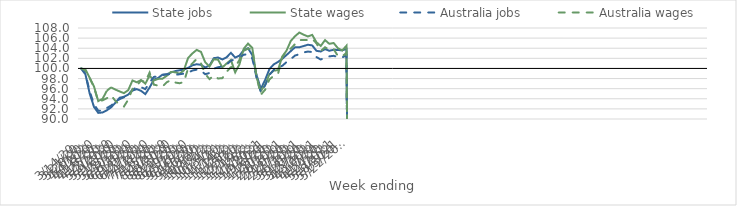
| Category | State jobs | State wages | Australia jobs | Australia wages |
|---|---|---|---|---|
| 14/03/2020 | 100 | 100 | 100 | 100 |
| 21/03/2020 | 98.841 | 99.801 | 98.971 | 99.605 |
| 28/03/2020 | 95.02 | 98.155 | 95.467 | 98.107 |
| 04/04/2020 | 92.402 | 96.441 | 92.92 | 96.258 |
| 11/04/2020 | 91.208 | 93.545 | 91.648 | 93.491 |
| 18/04/2020 | 91.29 | 93.985 | 91.631 | 93.694 |
| 25/04/2020 | 91.717 | 95.578 | 92.162 | 94.113 |
| 02/05/2020 | 92.306 | 96.263 | 92.658 | 94.675 |
| 09/05/2020 | 93.209 | 95.82 | 93.343 | 93.583 |
| 16/05/2020 | 94.202 | 95.457 | 93.936 | 92.817 |
| 23/05/2020 | 94.398 | 95.113 | 94.293 | 92.47 |
| 30/05/2020 | 94.827 | 95.705 | 94.8 | 93.82 |
| 06/06/2020 | 95.613 | 97.622 | 95.784 | 95.934 |
| 13/06/2020 | 95.907 | 97.263 | 96.283 | 96.613 |
| 20/06/2020 | 95.567 | 97.71 | 96.299 | 97.596 |
| 27/06/2020 | 94.925 | 96.992 | 95.908 | 97.351 |
| 04/07/2020 | 96.222 | 98.58 | 97.201 | 99.182 |
| 11/07/2020 | 97.792 | 97.624 | 98.328 | 96.791 |
| 18/07/2020 | 98.117 | 97.931 | 98.432 | 96.609 |
| 25/07/2020 | 98.774 | 97.968 | 98.653 | 96.408 |
| 01/08/2020 | 98.822 | 98.536 | 98.875 | 97.263 |
| 08/08/2020 | 99.214 | 99.312 | 98.872 | 97.698 |
| 15/08/2020 | 99.475 | 99.249 | 98.757 | 97.212 |
| 22/08/2020 | 99.644 | 98.949 | 98.844 | 97.073 |
| 29/08/2020 | 99.782 | 99.612 | 98.982 | 97.295 |
| 05/09/2020 | 100.115 | 102.086 | 99.167 | 100.035 |
| 12/09/2020 | 100.632 | 102.969 | 99.586 | 101.016 |
| 19/09/2020 | 100.825 | 103.671 | 99.757 | 101.878 |
| 26/09/2020 | 100.718 | 103.278 | 99.556 | 101.032 |
| 03/10/2020 | 100.194 | 101.216 | 98.852 | 98.907 |
| 10/10/2020 | 100.574 | 100.396 | 99.105 | 97.892 |
| 17/10/2020 | 102.028 | 101.809 | 99.955 | 98.589 |
| 24/10/2020 | 102.159 | 101.728 | 100.247 | 98.012 |
| 31/10/2020 | 101.78 | 100.204 | 100.384 | 98.084 |
| 07/11/2020 | 102.207 | 100.976 | 100.771 | 99.334 |
| 14/11/2020 | 103.089 | 101.68 | 101.516 | 100.252 |
| 21/11/2020 | 102.155 | 99.222 | 101.84 | 100.323 |
| 28/11/2020 | 102.536 | 100.812 | 102.16 | 101.68 |
| 05/12/2020 | 103.619 | 103.9 | 102.718 | 103.493 |
| 12/12/2020 | 104.001 | 104.911 | 102.789 | 103.93 |
| 19/12/2020 | 102.636 | 104.062 | 101.986 | 103.809 |
| 26/12/2020 | 98.677 | 98.215 | 98.188 | 98.338 |
| 02/01/2021 | 95.974 | 95.546 | 95.282 | 94.812 |
| 09/01/2021 | 97.722 | 96.765 | 96.645 | 95.793 |
| 16/01/2021 | 99.871 | 98.86 | 98.738 | 97.83 |
| 23/01/2021 | 100.792 | 99.561 | 99.703 | 98.519 |
| 30/01/2021 | 101.282 | 99.669 | 100.182 | 98.873 |
| 06/02/2021 | 101.904 | 102.357 | 100.516 | 102.171 |
| 13/02/2021 | 102.655 | 103.521 | 101.256 | 103.38 |
| 20/02/2021 | 103.434 | 105.446 | 101.855 | 103.943 |
| 27/02/2021 | 104.21 | 106.379 | 102.556 | 104.829 |
| 06/03/2021 | 104.192 | 107.106 | 102.809 | 105.611 |
| 13/03/2021 | 104.432 | 106.673 | 103.171 | 105.63 |
| 20/03/2021 | 104.688 | 106.328 | 103.339 | 105.616 |
| 27/03/2021 | 104.557 | 106.643 | 103.246 | 105.876 |
| 03/04/2021 | 103.485 | 105.174 | 102.251 | 104.958 |
| 10/04/2021 | 103.354 | 104.456 | 101.76 | 103.45 |
| 17/04/2021 | 103.821 | 105.606 | 102.161 | 104.184 |
| 24/04/2021 | 103.495 | 104.871 | 102.386 | 103.705 |
| 01/05/2021 | 103.696 | 105.037 | 102.495 | 103.842 |
| 08/05/2021 | 103.652 | 104.016 | 102.264 | 102.466 |
| 15/05/2021 | 103.578 | 103.547 | 102.191 | 102.371 |
| 22/05/2021 | 103.85 | 104.485 | 102.592 | 103.091 |